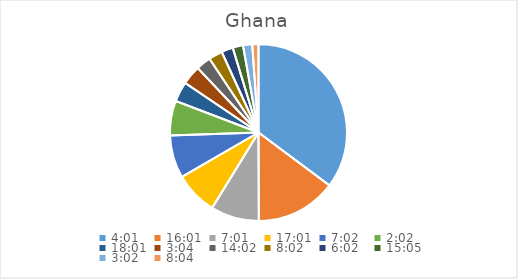
| Category | Series 0 |
|---|---|
| 0.1673611111111111 | 40.774 |
| 0.6673611111111111 | 17.079 |
| 0.2923611111111111 | 10.238 |
| 0.7090277777777777 | 9.13 |
| 0.29305555555555557 | 9.058 |
| 0.08472222222222221 | 7.326 |
| 0.7506944444444444 | 4.234 |
| 0.1277777777777778 | 4.07 |
| 0.5847222222222223 | 3.13 |
| 0.3347222222222222 | 2.922 |
| 0.2513888888888889 | 2.444 |
| 0.6284722222222222 | 2.191 |
| 0.12638888888888888 | 1.94 |
| 0.3361111111111111 | 1.316 |